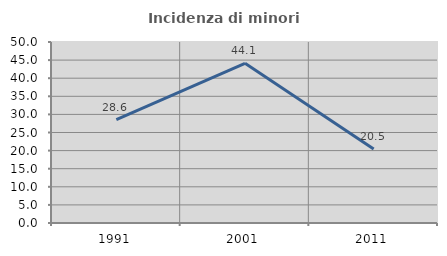
| Category | Incidenza di minori stranieri |
|---|---|
| 1991.0 | 28.571 |
| 2001.0 | 44.118 |
| 2011.0 | 20.455 |